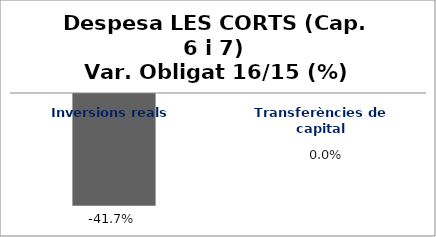
| Category | Series 0 |
|---|---|
| Inversions reals | -0.417 |
| Transferències de capital | 0 |